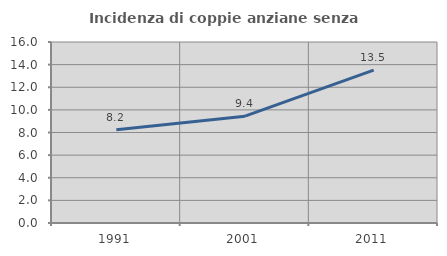
| Category | Incidenza di coppie anziane senza figli  |
|---|---|
| 1991.0 | 8.248 |
| 2001.0 | 9.445 |
| 2011.0 | 13.509 |